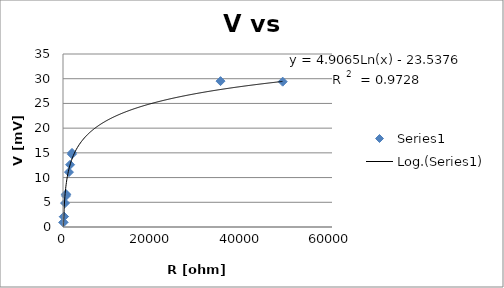
| Category | Series 0 |
|---|---|
| 89.0 | 0.93 |
| 90.0 | 0.948 |
| 197.0 | 2.08 |
| 198.0 | 2.11 |
| 460.0 | 4.84 |
| 650.0 | 6.63 |
| 669.0 | 6.29 |
| 706.0 | 6.62 |
| 1327.0 | 11.1 |
| 1585.0 | 12.6 |
| 1986.0 | 14.727 |
| 2013.0 | 14.987 |
| 35135.0 | 29.51 |
| 49000.0 | 29.4 |